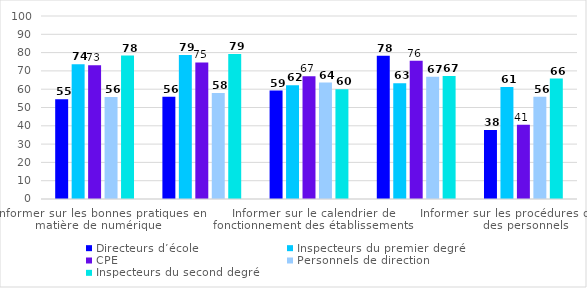
| Category | Directeurs d’école | Inspecteurs du premier degré | CPE | Personnels de direction | Inspecteurs du second degré |
|---|---|---|---|---|---|
| Informer sur les bonnes pratiques en matière de numérique | 54.567 | 73.645 | 73.093 | 55.726 | 78.378 |
| Faciliter la mise en œuvre du dispositif de continuité pédagogique | 55.862 | 78.702 | 74.645 | 57.925 | 79.21 |
| Informer sur le calendrier de fonctionnement des établissements | 59.279 | 62.145 | 67.138 | 63.657 | 60.023 |
| Informer sur les procédures en période de confinement  | 78.262 | 63.192 | 75.514 | 66.824 | 67.238 |
| Informer sur les procédures de gestion des personnels | 37.676 | 61.181 | 40.618 | 55.926 | 65.847 |